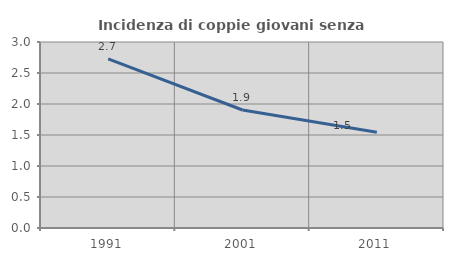
| Category | Incidenza di coppie giovani senza figli |
|---|---|
| 1991.0 | 2.729 |
| 2001.0 | 1.903 |
| 2011.0 | 1.544 |